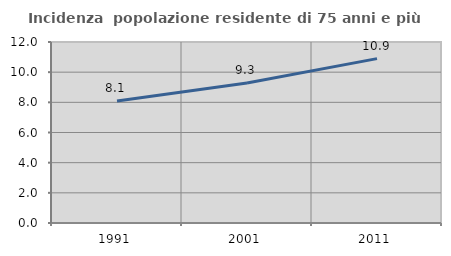
| Category | Incidenza  popolazione residente di 75 anni e più |
|---|---|
| 1991.0 | 8.086 |
| 2001.0 | 9.28 |
| 2011.0 | 10.899 |